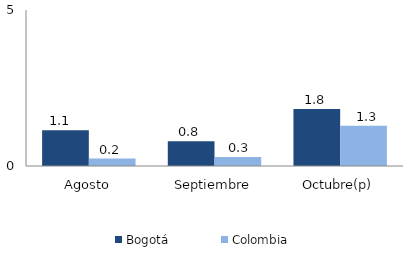
| Category | Bogotá | Colombia |
|---|---|---|
| Agosto | 1.142 | 0.239 |
| Septiembre | 0.795 | 0.289 |
| Octubre(p) | 1.829 | 1.291 |